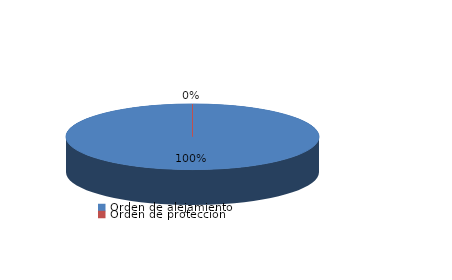
| Category | Series 0 |
|---|---|
| Orden de alejamiento | 43 |
| Orden de protección | 0 |